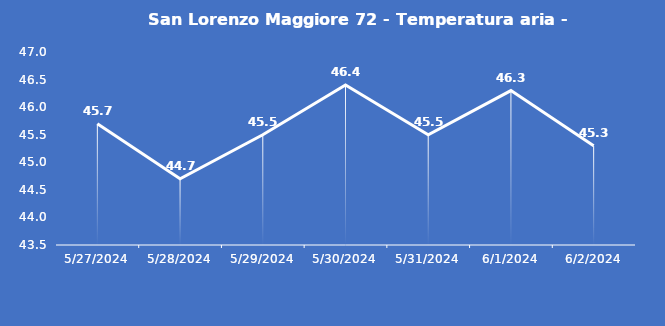
| Category | San Lorenzo Maggiore 72 - Temperatura aria - Grezzo (°C) |
|---|---|
| 5/27/24 | 45.7 |
| 5/28/24 | 44.7 |
| 5/29/24 | 45.5 |
| 5/30/24 | 46.4 |
| 5/31/24 | 45.5 |
| 6/1/24 | 46.3 |
| 6/2/24 | 45.3 |